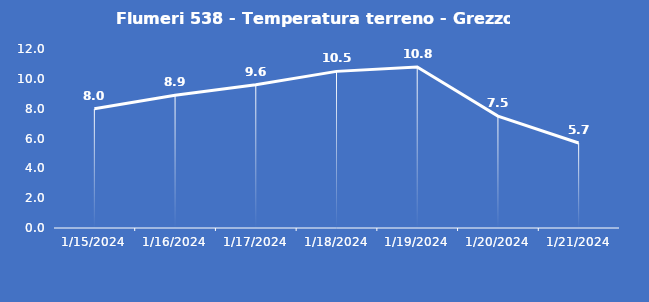
| Category | Flumeri 538 - Temperatura terreno - Grezzo (°C) |
|---|---|
| 1/15/24 | 8 |
| 1/16/24 | 8.9 |
| 1/17/24 | 9.6 |
| 1/18/24 | 10.5 |
| 1/19/24 | 10.8 |
| 1/20/24 | 7.5 |
| 1/21/24 | 5.7 |